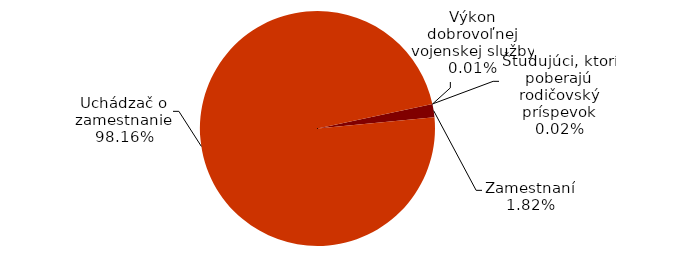
| Category | Series 0 |
|---|---|
| Zamestnaní | 706.25 |
| Uchádzač o zamestnanie | 38104.333 |
| Študujúci, ktorí poberajú rodičovský príspevok | 7.583 |
| Výkon dobrovoľnej vojenskej služby | 0.333 |